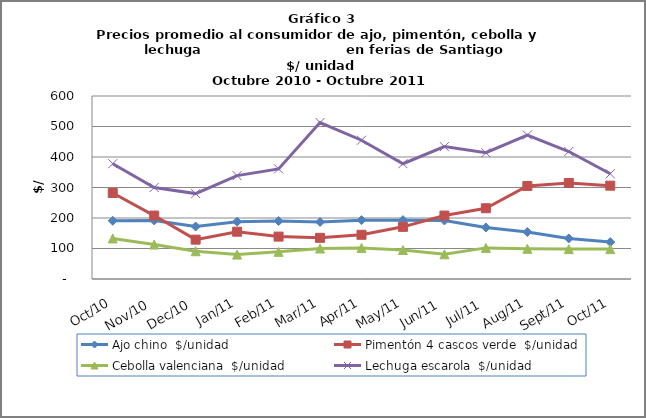
| Category | Ajo chino  | Pimentón 4 cascos verde  | Cebolla valenciana  | Lechuga escarola  |
|---|---|---|---|---|
| 2010-10-01 | 191 | 282 | 133 | 378 |
| 2010-11-01 | 192 | 208 | 113 | 300 |
| 2010-12-01 | 172 | 129 | 91 | 280 |
| 2011-01-01 | 188 | 155 | 80 | 339 |
| 2011-02-01 | 190 | 139 | 89 | 361 |
| 2011-03-01 | 187 | 135 | 100 | 513 |
| 2011-04-01 | 193 | 145 | 102 | 455 |
| 2011-05-01 | 193 | 171 | 95 | 378 |
| 2011-06-01 | 192 | 208 | 81 | 434 |
| 2011-07-01 | 169 | 232 | 102 | 414 |
| 2011-08-01 | 154 | 305 | 99 | 472 |
| 2011-09-01 | 133 | 315 | 98 | 418 |
| 2011-10-01 | 121 | 306 | 98 | 345 |